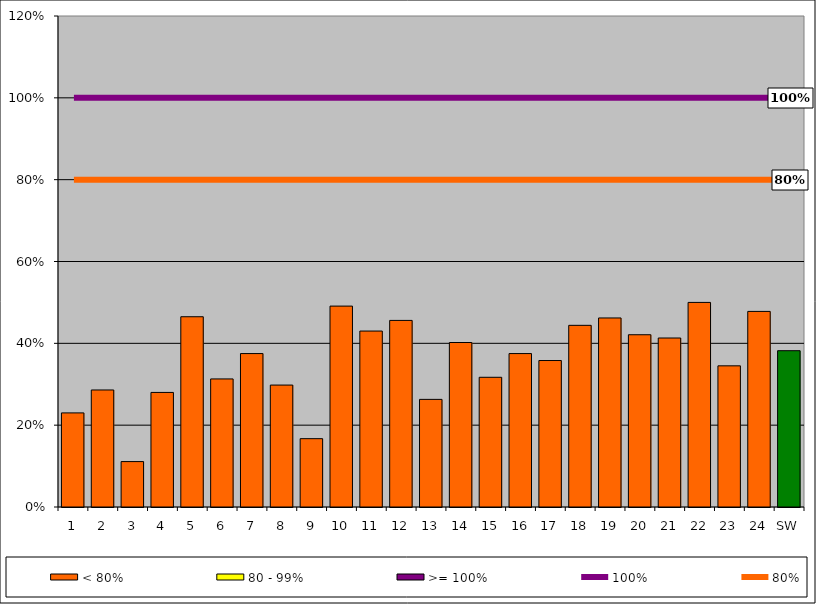
| Category | < 80% | 80 - 99% | >= 100% |
|---|---|---|---|
| 1 | 0.23 | 0 | 0 |
| 2 | 0.286 | 0 | 0 |
| 3 | 0.111 | 0 | 0 |
| 4 | 0.28 | 0 | 0 |
| 5 | 0.465 | 0 | 0 |
| 6 | 0.313 | 0 | 0 |
| 7 | 0.375 | 0 | 0 |
| 8 | 0.298 | 0 | 0 |
| 9 | 0.167 | 0 | 0 |
| 10 | 0.491 | 0 | 0 |
| 11 | 0.43 | 0 | 0 |
| 12 | 0.456 | 0 | 0 |
| 13 | 0.263 | 0 | 0 |
| 14 | 0.402 | 0 | 0 |
| 15 | 0.317 | 0 | 0 |
| 16 | 0.375 | 0 | 0 |
| 17 | 0.358 | 0 | 0 |
| 18 | 0.444 | 0 | 0 |
| 19 | 0.462 | 0 | 0 |
| 20 | 0.421 | 0 | 0 |
| 21 | 0.413 | 0 | 0 |
| 22 | 0.5 | 0 | 0 |
| 23 | 0.345 | 0 | 0 |
| 24 | 0.478 | 0 | 0 |
| SW | 0.382 | 0 | 0 |